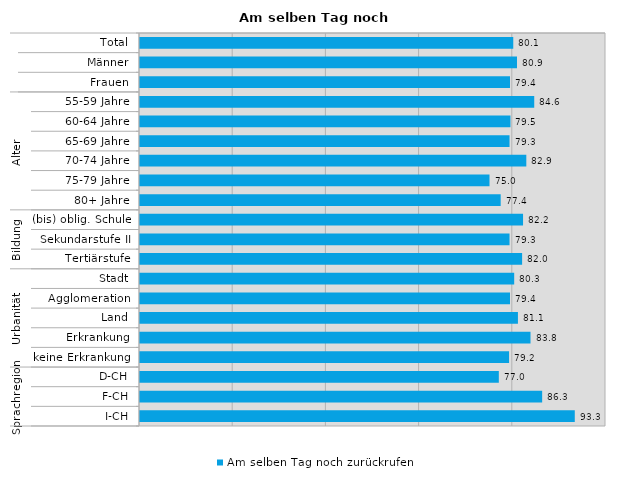
| Category | Am selben Tag noch zurückrufen |
|---|---|
| 0 | 80.1 |
| 1 | 80.9 |
| 2 | 79.4 |
| 3 | 84.6 |
| 4 | 79.5 |
| 5 | 79.3 |
| 6 | 82.9 |
| 7 | 75 |
| 8 | 77.4 |
| 9 | 82.2 |
| 10 | 79.3 |
| 11 | 82 |
| 12 | 80.3 |
| 13 | 79.4 |
| 14 | 81.1 |
| 15 | 83.8 |
| 16 | 79.2 |
| 17 | 77 |
| 18 | 86.3 |
| 19 | 93.3 |